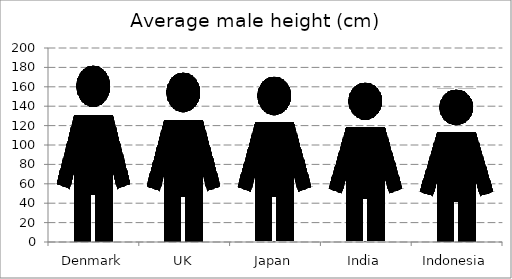
| Category | Average male height (cm) |
|---|---|
| Denmark | 182.6 |
| UK | 175.3 |
| Japan | 170.7 |
| India | 164.7 |
| Indonesia | 158 |